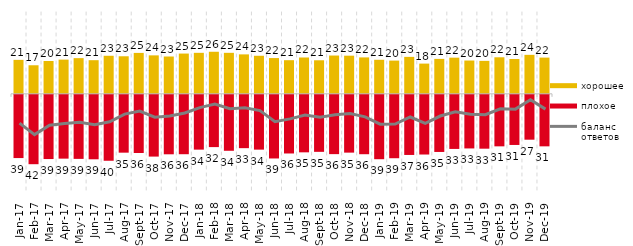
| Category | хорошее | плохое |
|---|---|---|
| 2017-01-01 | 20.75 | -38.65 |
| 2017-02-01 | 17.45 | -42.4 |
| 2017-03-01 | 20.05 | -39.25 |
| 2017-04-01 | 20.9 | -39 |
| 2017-05-01 | 21.8 | -39.15 |
| 2017-06-01 | 20.55 | -39.4 |
| 2017-07-01 | 23.25 | -40.3 |
| 2017-08-01 | 22.95 | -35.35 |
| 2017-09-01 | 25 | -35.55 |
| 2017-10-01 | 23.5 | -37.75 |
| 2017-11-01 | 22.8 | -36.35 |
| 2017-12-01 | 24.6 | -36.3 |
| 2018-01-01 | 25.05 | -33.5 |
| 2018-02-01 | 25.7 | -31.95 |
| 2018-03-01 | 25.05 | -34.2 |
| 2018-04-01 | 24.1 | -32.6 |
| 2018-05-01 | 23.25 | -33.5 |
| 2018-06-01 | 21.85 | -38.9 |
| 2018-07-01 | 20.55 | -35.85 |
| 2018-08-01 | 22.2 | -35.15 |
| 2018-09-01 | 20.5 | -34.85 |
| 2018-10-01 | 23.4 | -36.25 |
| 2018-11-01 | 23.303 | -35.329 |
| 2018-12-01 | 22.25 | -36.3 |
| 2019-01-01 | 20.8 | -39.35 |
| 2019-02-01 | 20.3 | -38.75 |
| 2019-03-01 | 22.576 | -36.748 |
| 2019-04-01 | 18.465 | -36.485 |
| 2019-05-01 | 21.347 | -34.918 |
| 2019-06-01 | 22.095 | -33.067 |
| 2019-07-01 | 20.347 | -32.772 |
| 2019-08-01 | 20.13 | -32.917 |
| 2019-09-01 | 22.327 | -31.485 |
| 2019-10-01 | 21.287 | -30.644 |
| 2019-11-01 | 23.812 | -27.426 |
| 2019-12-01 | 22.129 | -31.485 |